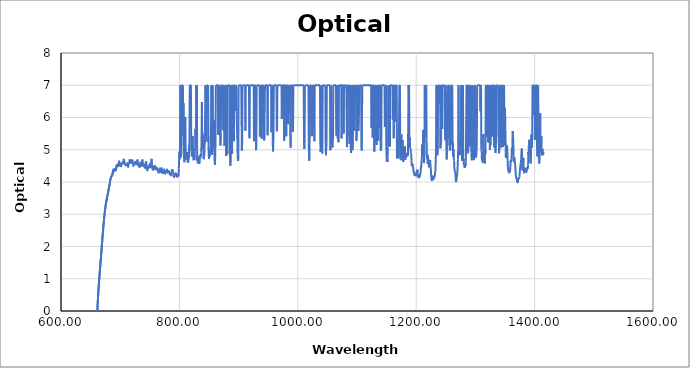
| Category | Optical Density |
|---|---|
| 365.0 | -1.958 |
| 365.5 | -1.958 |
| 366.0 | -1.958 |
| 366.5 | -1.959 |
| 367.0 | -1.959 |
| 367.5 | -1.96 |
| 368.0 | -1.961 |
| 368.5 | -1.962 |
| 369.0 | -1.962 |
| 369.5 | -1.961 |
| 370.0 | -1.961 |
| 370.5 | -1.959 |
| 371.0 | -1.958 |
| 371.5 | -1.958 |
| 372.0 | -1.958 |
| 372.5 | -1.958 |
| 373.0 | -1.958 |
| 373.5 | -1.958 |
| 374.0 | -1.957 |
| 374.5 | -1.956 |
| 375.0 | -1.955 |
| 375.5 | -1.953 |
| 376.0 | -1.953 |
| 376.5 | -1.953 |
| 377.0 | -1.954 |
| 377.5 | -1.955 |
| 378.0 | -1.957 |
| 378.5 | -1.959 |
| 379.0 | -1.96 |
| 379.5 | -1.96 |
| 380.0 | -1.959 |
| 380.5 | -1.957 |
| 381.0 | -1.955 |
| 381.5 | -1.953 |
| 382.0 | -1.951 |
| 382.5 | -1.95 |
| 383.0 | -1.951 |
| 383.5 | -1.953 |
| 384.0 | -1.956 |
| 384.5 | -1.959 |
| 385.0 | -1.961 |
| 385.5 | -1.962 |
| 386.0 | -1.962 |
| 386.5 | -1.963 |
| 387.0 | -1.964 |
| 387.5 | -1.964 |
| 388.0 | -1.962 |
| 388.5 | -1.96 |
| 389.0 | -1.958 |
| 389.5 | -1.958 |
| 390.0 | -1.959 |
| 390.5 | -1.961 |
| 391.0 | -1.964 |
| 391.5 | -1.966 |
| 392.0 | -1.967 |
| 392.5 | -1.967 |
| 393.0 | -1.967 |
| 393.5 | -1.965 |
| 394.0 | -1.964 |
| 394.5 | -1.963 |
| 395.0 | -1.964 |
| 395.5 | -1.965 |
| 396.0 | -1.967 |
| 396.5 | -1.967 |
| 397.0 | -1.966 |
| 397.5 | -1.965 |
| 398.0 | -1.963 |
| 398.5 | -1.963 |
| 399.0 | -1.963 |
| 399.5 | -1.964 |
| 400.0 | -1.965 |
| 400.5 | -1.966 |
| 401.0 | -1.968 |
| 401.5 | -1.97 |
| 402.0 | -1.971 |
| 402.5 | -1.971 |
| 403.0 | -1.971 |
| 403.5 | -1.971 |
| 404.0 | -1.97 |
| 404.5 | -1.97 |
| 405.0 | -1.97 |
| 405.5 | -1.969 |
| 406.0 | -1.969 |
| 406.5 | -1.969 |
| 407.0 | -1.969 |
| 407.5 | -1.969 |
| 408.0 | -1.969 |
| 408.5 | -1.969 |
| 409.0 | -1.969 |
| 409.5 | -1.97 |
| 410.0 | -1.97 |
| 410.5 | -1.97 |
| 411.0 | -1.97 |
| 411.5 | -1.971 |
| 412.0 | -1.972 |
| 412.5 | -1.973 |
| 413.0 | -1.974 |
| 413.5 | -1.973 |
| 414.0 | -1.973 |
| 414.5 | -1.972 |
| 415.0 | -1.972 |
| 415.5 | -1.972 |
| 416.0 | -1.972 |
| 416.5 | -1.971 |
| 417.0 | -1.97 |
| 417.5 | -1.969 |
| 418.0 | -1.968 |
| 418.5 | -1.969 |
| 419.0 | -1.971 |
| 419.5 | -1.972 |
| 420.0 | -1.974 |
| 420.5 | -1.974 |
| 421.0 | -1.974 |
| 421.5 | -1.974 |
| 422.0 | -1.973 |
| 422.5 | -1.971 |
| 423.0 | -1.97 |
| 423.5 | -1.968 |
| 424.0 | -1.968 |
| 424.5 | -1.968 |
| 425.0 | -1.97 |
| 425.5 | -1.972 |
| 426.0 | -1.974 |
| 426.5 | -1.975 |
| 427.0 | -1.975 |
| 427.5 | -1.976 |
| 428.0 | -1.976 |
| 428.5 | -1.976 |
| 429.0 | -1.976 |
| 429.5 | -1.975 |
| 430.0 | -1.975 |
| 430.5 | -1.975 |
| 431.0 | -1.974 |
| 431.5 | -1.974 |
| 432.0 | -1.973 |
| 432.5 | -1.972 |
| 433.0 | -1.972 |
| 433.5 | -1.971 |
| 434.0 | -1.97 |
| 434.5 | -1.97 |
| 435.0 | -1.97 |
| 435.5 | -1.971 |
| 436.0 | -1.971 |
| 436.5 | -1.972 |
| 437.0 | -1.973 |
| 437.5 | -1.974 |
| 438.0 | -1.975 |
| 438.5 | -1.976 |
| 439.0 | -1.976 |
| 439.5 | -1.976 |
| 440.0 | -1.976 |
| 440.5 | -1.976 |
| 441.0 | -1.977 |
| 441.5 | -1.977 |
| 442.0 | -1.977 |
| 442.5 | -1.976 |
| 443.0 | -1.976 |
| 443.5 | -1.976 |
| 444.0 | -1.976 |
| 444.5 | -1.976 |
| 445.0 | -1.974 |
| 445.5 | -1.973 |
| 446.0 | -1.972 |
| 446.5 | -1.971 |
| 447.0 | -1.971 |
| 447.5 | -1.972 |
| 448.0 | -1.973 |
| 448.5 | -1.975 |
| 449.0 | -1.976 |
| 449.5 | -1.976 |
| 450.0 | -1.976 |
| 450.5 | -1.976 |
| 451.0 | -1.975 |
| 451.5 | -1.975 |
| 452.0 | -1.974 |
| 452.5 | -1.972 |
| 453.0 | -1.97 |
| 453.5 | -1.968 |
| 454.0 | -1.966 |
| 454.5 | -1.966 |
| 455.0 | -1.966 |
| 455.5 | -1.967 |
| 456.0 | -1.969 |
| 456.5 | -1.971 |
| 457.0 | -1.973 |
| 457.5 | -1.975 |
| 458.0 | -1.976 |
| 458.5 | -1.976 |
| 459.0 | -1.976 |
| 459.5 | -1.975 |
| 460.0 | -1.974 |
| 460.5 | -1.973 |
| 461.0 | -1.971 |
| 461.5 | -1.97 |
| 462.0 | -1.97 |
| 462.5 | -1.969 |
| 463.0 | -1.969 |
| 463.5 | -1.969 |
| 464.0 | -1.968 |
| 464.5 | -1.968 |
| 465.0 | -1.967 |
| 465.5 | -1.967 |
| 466.0 | -1.967 |
| 466.5 | -1.968 |
| 467.0 | -1.969 |
| 467.5 | -1.971 |
| 468.0 | -1.972 |
| 468.5 | -1.973 |
| 469.0 | -1.974 |
| 469.5 | -1.975 |
| 470.0 | -1.976 |
| 470.5 | -1.977 |
| 471.0 | -1.978 |
| 471.5 | -1.978 |
| 472.0 | -1.978 |
| 472.5 | -1.978 |
| 473.0 | -1.978 |
| 473.5 | -1.978 |
| 474.0 | -1.978 |
| 474.5 | -1.978 |
| 475.0 | -1.978 |
| 475.5 | -1.978 |
| 476.0 | -1.979 |
| 476.5 | -1.979 |
| 477.0 | -1.979 |
| 477.5 | -1.978 |
| 478.0 | -1.977 |
| 478.5 | -1.976 |
| 479.0 | -1.973 |
| 479.5 | -1.971 |
| 480.0 | -1.968 |
| 480.5 | -1.966 |
| 481.0 | -1.964 |
| 481.5 | -1.962 |
| 482.0 | -1.961 |
| 482.5 | -1.961 |
| 483.0 | -1.962 |
| 483.5 | -1.962 |
| 484.0 | -1.964 |
| 484.5 | -1.966 |
| 485.0 | -1.968 |
| 485.5 | -1.97 |
| 486.0 | -1.973 |
| 486.5 | -1.975 |
| 487.0 | -1.977 |
| 487.5 | -1.978 |
| 488.0 | -1.978 |
| 488.5 | -1.977 |
| 489.0 | -1.976 |
| 489.5 | -1.974 |
| 490.0 | -1.973 |
| 490.5 | -1.973 |
| 491.0 | -1.973 |
| 491.5 | -1.975 |
| 492.0 | -1.977 |
| 492.5 | -1.979 |
| 493.0 | -1.98 |
| 493.5 | -1.981 |
| 494.0 | -1.982 |
| 494.5 | -1.981 |
| 495.0 | -1.979 |
| 495.5 | -1.976 |
| 496.0 | -1.973 |
| 496.5 | -1.97 |
| 497.0 | -1.968 |
| 497.5 | -1.966 |
| 498.0 | -1.966 |
| 498.5 | -1.968 |
| 499.0 | -1.97 |
| 499.5 | -1.973 |
| 500.0 | -1.975 |
| 500.5 | -1.978 |
| 501.0 | -1.979 |
| 501.5 | -1.98 |
| 502.0 | -1.981 |
| 502.5 | -1.981 |
| 503.0 | -1.982 |
| 503.5 | -1.982 |
| 504.0 | -1.982 |
| 504.5 | -1.982 |
| 505.0 | -1.981 |
| 505.5 | -1.98 |
| 506.0 | -1.979 |
| 506.5 | -1.979 |
| 507.0 | -1.978 |
| 507.5 | -1.979 |
| 508.0 | -1.98 |
| 508.5 | -1.981 |
| 509.0 | -1.981 |
| 509.5 | -1.981 |
| 510.0 | -1.981 |
| 510.5 | -1.98 |
| 511.0 | -1.978 |
| 511.5 | -1.976 |
| 512.0 | -1.973 |
| 512.5 | -1.97 |
| 513.0 | -1.966 |
| 513.5 | -1.963 |
| 514.0 | -1.959 |
| 514.5 | -1.955 |
| 515.0 | -1.951 |
| 515.5 | -1.949 |
| 516.0 | -1.948 |
| 516.5 | -1.949 |
| 517.0 | -1.952 |
| 517.5 | -1.956 |
| 518.0 | -1.961 |
| 518.5 | -1.966 |
| 519.0 | -1.971 |
| 519.5 | -1.975 |
| 520.0 | -1.978 |
| 520.5 | -1.98 |
| 521.0 | -1.981 |
| 521.5 | -1.982 |
| 522.0 | -1.982 |
| 522.5 | -1.981 |
| 523.0 | -1.98 |
| 523.5 | -1.978 |
| 524.0 | -1.976 |
| 524.5 | -1.974 |
| 525.0 | -1.973 |
| 525.5 | -1.972 |
| 526.0 | -1.973 |
| 526.5 | -1.974 |
| 527.0 | -1.976 |
| 527.5 | -1.978 |
| 528.0 | -1.98 |
| 528.5 | -1.982 |
| 529.0 | -1.983 |
| 529.5 | -1.984 |
| 530.0 | -1.984 |
| 530.5 | -1.984 |
| 531.0 | -1.985 |
| 531.5 | -1.985 |
| 532.0 | -1.985 |
| 532.5 | -1.985 |
| 533.0 | -1.985 |
| 533.5 | -1.985 |
| 534.0 | -1.984 |
| 534.5 | -1.984 |
| 535.0 | -1.983 |
| 535.5 | -1.983 |
| 536.0 | -1.983 |
| 536.5 | -1.984 |
| 537.0 | -1.985 |
| 537.5 | -1.985 |
| 538.0 | -1.986 |
| 538.5 | -1.985 |
| 539.0 | -1.985 |
| 539.5 | -1.984 |
| 540.0 | -1.982 |
| 540.5 | -1.981 |
| 541.0 | -1.981 |
| 541.5 | -1.981 |
| 542.0 | -1.981 |
| 542.5 | -1.982 |
| 543.0 | -1.983 |
| 543.5 | -1.984 |
| 544.0 | -1.985 |
| 544.5 | -1.985 |
| 545.0 | -1.986 |
| 545.5 | -1.986 |
| 546.0 | -1.987 |
| 546.5 | -1.987 |
| 547.0 | -1.986 |
| 547.5 | -1.985 |
| 548.0 | -1.984 |
| 548.5 | -1.983 |
| 549.0 | -1.981 |
| 549.5 | -1.98 |
| 550.0 | -1.978 |
| 550.5 | -1.976 |
| 551.0 | -1.975 |
| 551.5 | -1.974 |
| 552.0 | -1.974 |
| 552.5 | -1.974 |
| 553.0 | -1.976 |
| 553.5 | -1.978 |
| 554.0 | -1.981 |
| 554.5 | -1.983 |
| 555.0 | -1.985 |
| 555.5 | -1.986 |
| 556.0 | -1.987 |
| 556.5 | -1.987 |
| 557.0 | -1.987 |
| 557.5 | -1.987 |
| 558.0 | -1.986 |
| 558.5 | -1.986 |
| 559.0 | -1.986 |
| 559.5 | -1.985 |
| 560.0 | -1.984 |
| 560.5 | -1.983 |
| 561.0 | -1.982 |
| 561.5 | -1.98 |
| 562.0 | -1.978 |
| 562.5 | -1.977 |
| 563.0 | -1.977 |
| 563.5 | -1.977 |
| 564.0 | -1.978 |
| 564.5 | -1.98 |
| 565.0 | -1.981 |
| 565.5 | -1.982 |
| 566.0 | -1.983 |
| 566.5 | -1.984 |
| 567.0 | -1.984 |
| 567.5 | -1.984 |
| 568.0 | -1.984 |
| 568.5 | -1.984 |
| 569.0 | -1.984 |
| 569.5 | -1.984 |
| 570.0 | -1.984 |
| 570.5 | -1.983 |
| 571.0 | -1.982 |
| 571.5 | -1.981 |
| 572.0 | -1.98 |
| 572.5 | -1.978 |
| 573.0 | -1.976 |
| 573.5 | -1.974 |
| 574.0 | -1.973 |
| 574.5 | -1.973 |
| 575.0 | -1.974 |
| 575.5 | -1.975 |
| 576.0 | -1.977 |
| 576.5 | -1.979 |
| 577.0 | -1.98 |
| 577.5 | -1.981 |
| 578.0 | -1.981 |
| 578.5 | -1.981 |
| 579.0 | -1.98 |
| 579.5 | -1.98 |
| 580.0 | -1.979 |
| 580.5 | -1.979 |
| 581.0 | -1.98 |
| 581.5 | -1.98 |
| 582.0 | -1.981 |
| 582.5 | -1.981 |
| 583.0 | -1.98 |
| 583.5 | -1.979 |
| 584.0 | -1.977 |
| 584.5 | -1.976 |
| 585.0 | -1.974 |
| 585.5 | -1.973 |
| 586.0 | -1.972 |
| 586.5 | -1.973 |
| 587.0 | -1.974 |
| 587.5 | -1.976 |
| 588.0 | -1.977 |
| 588.5 | -1.978 |
| 589.0 | -1.979 |
| 589.5 | -1.979 |
| 590.0 | -1.978 |
| 590.5 | -1.978 |
| 591.0 | -1.978 |
| 591.5 | -1.978 |
| 592.0 | -1.978 |
| 592.5 | -1.979 |
| 593.0 | -1.98 |
| 593.5 | -1.981 |
| 594.0 | -1.982 |
| 594.5 | -1.983 |
| 595.0 | -1.983 |
| 595.5 | -1.983 |
| 596.0 | -1.983 |
| 596.5 | -1.983 |
| 597.0 | -1.982 |
| 597.5 | -1.982 |
| 598.0 | -1.982 |
| 598.5 | -1.983 |
| 599.0 | -1.983 |
| 599.5 | -1.984 |
| 600.0 | -1.985 |
| 600.5 | -1.985 |
| 601.0 | -1.985 |
| 601.5 | -1.985 |
| 602.0 | -1.984 |
| 602.5 | -1.982 |
| 603.0 | -1.98 |
| 603.5 | -1.979 |
| 604.0 | -1.978 |
| 604.5 | -1.978 |
| 605.0 | -1.978 |
| 605.5 | -1.979 |
| 606.0 | -1.98 |
| 606.5 | -1.981 |
| 607.0 | -1.982 |
| 607.5 | -1.983 |
| 608.0 | -1.984 |
| 608.5 | -1.984 |
| 609.0 | -1.985 |
| 609.5 | -1.985 |
| 610.0 | -1.985 |
| 610.5 | -1.986 |
| 611.0 | -1.986 |
| 611.5 | -1.986 |
| 612.0 | -1.986 |
| 612.5 | -1.986 |
| 613.0 | -1.985 |
| 613.5 | -1.984 |
| 614.0 | -1.983 |
| 614.5 | -1.982 |
| 615.0 | -1.98 |
| 615.5 | -1.978 |
| 616.0 | -1.977 |
| 616.5 | -1.976 |
| 617.0 | -1.975 |
| 617.5 | -1.976 |
| 618.0 | -1.977 |
| 618.5 | -1.978 |
| 619.0 | -1.98 |
| 619.5 | -1.981 |
| 620.0 | -1.983 |
| 620.5 | -1.984 |
| 621.0 | -1.985 |
| 621.5 | -1.986 |
| 622.0 | -1.986 |
| 622.5 | -1.986 |
| 623.0 | -1.985 |
| 623.5 | -1.985 |
| 624.0 | -1.985 |
| 624.5 | -1.985 |
| 625.0 | -1.985 |
| 625.5 | -1.984 |
| 626.0 | -1.983 |
| 626.5 | -1.981 |
| 627.0 | -1.979 |
| 627.5 | -1.977 |
| 628.0 | -1.975 |
| 628.5 | -1.973 |
| 629.0 | -1.972 |
| 629.5 | -1.972 |
| 630.0 | -1.973 |
| 630.5 | -1.974 |
| 631.0 | -1.976 |
| 631.5 | -1.977 |
| 632.0 | -1.979 |
| 632.5 | -1.98 |
| 633.0 | -1.981 |
| 633.5 | -1.981 |
| 634.0 | -1.982 |
| 634.5 | -1.982 |
| 635.0 | -1.983 |
| 635.5 | -1.983 |
| 636.0 | -1.984 |
| 636.5 | -1.985 |
| 637.0 | -1.986 |
| 637.5 | -1.986 |
| 638.0 | -1.986 |
| 638.5 | -1.986 |
| 639.0 | -1.986 |
| 639.5 | -1.985 |
| 640.0 | -1.984 |
| 640.5 | -1.983 |
| 641.0 | -1.982 |
| 641.5 | -1.982 |
| 642.0 | -1.983 |
| 642.5 | -1.983 |
| 643.0 | -1.984 |
| 643.5 | -1.985 |
| 644.0 | -1.985 |
| 644.5 | -1.985 |
| 645.0 | -1.984 |
| 645.5 | -1.983 |
| 646.0 | -1.982 |
| 646.5 | -1.982 |
| 647.0 | -1.982 |
| 647.5 | -1.982 |
| 648.0 | -1.983 |
| 648.5 | -1.984 |
| 649.0 | -1.986 |
| 649.5 | -1.987 |
| 650.0 | -1.988 |
| 650.5 | -1.988 |
| 651.0 | -1.987 |
| 651.5 | -1.987 |
| 652.0 | -1.987 |
| 652.5 | -1.987 |
| 653.0 | -1.986 |
| 653.5 | -1.985 |
| 654.0 | -1.979 |
| 654.5 | -1.969 |
| 655.0 | -1.949 |
| 655.5 | -1.916 |
| 656.0 | -1.865 |
| 656.5 | -1.791 |
| 657.0 | -1.691 |
| 657.5 | -1.563 |
| 658.0 | -1.403 |
| 658.5 | -1.217 |
| 659.0 | -1.008 |
| 659.5 | -0.786 |
| 660.0 | -0.56 |
| 660.5 | -0.34 |
| 661.0 | -0.132 |
| 661.5 | 0.064 |
| 662.0 | 0.244 |
| 662.5 | 0.412 |
| 663.0 | 0.568 |
| 663.5 | 0.712 |
| 664.0 | 0.847 |
| 664.5 | 0.974 |
| 665.0 | 1.095 |
| 665.5 | 1.213 |
| 666.0 | 1.328 |
| 666.5 | 1.442 |
| 667.0 | 1.557 |
| 667.5 | 1.672 |
| 668.0 | 1.79 |
| 668.5 | 1.908 |
| 669.0 | 2.026 |
| 669.5 | 2.146 |
| 670.0 | 2.263 |
| 670.5 | 2.378 |
| 671.0 | 2.491 |
| 671.5 | 2.6 |
| 672.0 | 2.705 |
| 672.5 | 2.804 |
| 673.0 | 2.897 |
| 673.5 | 2.984 |
| 674.0 | 3.063 |
| 674.5 | 3.141 |
| 675.0 | 3.215 |
| 675.5 | 3.28 |
| 676.0 | 3.339 |
| 676.5 | 3.392 |
| 677.0 | 3.443 |
| 677.5 | 3.493 |
| 678.0 | 3.537 |
| 678.5 | 3.582 |
| 679.0 | 3.621 |
| 679.5 | 3.667 |
| 680.0 | 3.723 |
| 680.5 | 3.779 |
| 681.0 | 3.834 |
| 681.5 | 3.871 |
| 682.0 | 3.915 |
| 682.5 | 3.967 |
| 683.0 | 4.035 |
| 683.5 | 4.08 |
| 684.0 | 4.109 |
| 684.5 | 4.145 |
| 685.0 | 4.165 |
| 685.5 | 4.189 |
| 686.0 | 4.195 |
| 686.5 | 4.216 |
| 687.0 | 4.241 |
| 687.5 | 4.298 |
| 688.0 | 4.354 |
| 688.5 | 4.381 |
| 689.0 | 4.326 |
| 689.5 | 4.345 |
| 690.0 | 4.357 |
| 690.5 | 4.397 |
| 691.0 | 4.403 |
| 691.5 | 4.402 |
| 692.0 | 4.395 |
| 692.5 | 4.361 |
| 693.0 | 4.404 |
| 693.5 | 4.447 |
| 694.0 | 4.509 |
| 694.5 | 4.506 |
| 695.0 | 4.513 |
| 695.5 | 4.53 |
| 696.0 | 4.546 |
| 696.5 | 4.498 |
| 697.0 | 4.499 |
| 697.5 | 4.529 |
| 698.0 | 4.633 |
| 698.5 | 4.635 |
| 699.0 | 4.595 |
| 699.5 | 4.568 |
| 700.0 | 4.539 |
| 700.5 | 4.493 |
| 701.0 | 4.502 |
| 701.5 | 4.492 |
| 702.0 | 4.551 |
| 702.5 | 4.55 |
| 703.0 | 4.585 |
| 703.5 | 4.567 |
| 704.0 | 4.581 |
| 704.5 | 4.581 |
| 705.0 | 4.607 |
| 705.5 | 4.674 |
| 706.0 | 4.696 |
| 706.5 | 4.688 |
| 707.0 | 4.629 |
| 707.5 | 4.607 |
| 708.0 | 4.544 |
| 708.5 | 4.527 |
| 709.0 | 4.515 |
| 709.5 | 4.533 |
| 710.0 | 4.532 |
| 710.5 | 4.541 |
| 711.0 | 4.532 |
| 711.5 | 4.543 |
| 712.0 | 4.586 |
| 712.5 | 4.549 |
| 713.0 | 4.493 |
| 713.5 | 4.469 |
| 714.0 | 4.539 |
| 714.5 | 4.58 |
| 715.0 | 4.585 |
| 715.5 | 4.604 |
| 716.0 | 4.705 |
| 716.5 | 4.677 |
| 717.0 | 4.64 |
| 717.5 | 4.592 |
| 718.0 | 4.641 |
| 718.5 | 4.649 |
| 719.0 | 4.601 |
| 719.5 | 4.63 |
| 720.0 | 4.65 |
| 720.5 | 4.697 |
| 721.0 | 4.625 |
| 721.5 | 4.563 |
| 722.0 | 4.505 |
| 722.5 | 4.503 |
| 723.0 | 4.533 |
| 723.5 | 4.554 |
| 724.0 | 4.575 |
| 724.5 | 4.568 |
| 725.0 | 4.596 |
| 725.5 | 4.631 |
| 726.0 | 4.596 |
| 726.5 | 4.579 |
| 727.0 | 4.548 |
| 727.5 | 4.56 |
| 728.0 | 4.58 |
| 728.5 | 4.619 |
| 729.0 | 4.698 |
| 729.5 | 4.649 |
| 730.0 | 4.557 |
| 730.5 | 4.511 |
| 731.0 | 4.53 |
| 731.5 | 4.518 |
| 732.0 | 4.498 |
| 732.5 | 4.454 |
| 733.0 | 4.499 |
| 733.5 | 4.55 |
| 734.0 | 4.602 |
| 734.5 | 4.594 |
| 735.0 | 4.523 |
| 735.5 | 4.504 |
| 736.0 | 4.475 |
| 736.5 | 4.584 |
| 737.0 | 4.637 |
| 737.5 | 4.698 |
| 738.0 | 4.62 |
| 738.5 | 4.535 |
| 739.0 | 4.522 |
| 739.5 | 4.537 |
| 740.0 | 4.542 |
| 740.5 | 4.543 |
| 741.0 | 4.444 |
| 741.5 | 4.489 |
| 742.0 | 4.419 |
| 742.5 | 4.502 |
| 743.0 | 4.548 |
| 743.5 | 4.645 |
| 744.0 | 4.587 |
| 744.5 | 4.517 |
| 745.0 | 4.405 |
| 745.5 | 4.385 |
| 746.0 | 4.361 |
| 746.5 | 4.439 |
| 747.0 | 4.483 |
| 747.5 | 4.476 |
| 748.0 | 4.462 |
| 748.5 | 4.441 |
| 749.0 | 4.465 |
| 749.5 | 4.513 |
| 750.0 | 4.564 |
| 750.5 | 4.515 |
| 751.0 | 4.484 |
| 751.5 | 4.435 |
| 752.0 | 4.524 |
| 752.5 | 4.613 |
| 753.0 | 4.719 |
| 753.5 | 4.581 |
| 754.0 | 4.453 |
| 754.5 | 4.398 |
| 755.0 | 4.433 |
| 755.5 | 4.401 |
| 756.0 | 4.376 |
| 756.5 | 4.395 |
| 757.0 | 4.426 |
| 757.5 | 4.507 |
| 758.0 | 4.458 |
| 758.5 | 4.504 |
| 759.0 | 4.455 |
| 759.5 | 4.479 |
| 760.0 | 4.411 |
| 760.5 | 4.394 |
| 761.0 | 4.388 |
| 761.5 | 4.403 |
| 762.0 | 4.437 |
| 762.5 | 4.405 |
| 763.0 | 4.374 |
| 763.5 | 4.36 |
| 764.0 | 4.329 |
| 764.5 | 4.329 |
| 765.0 | 4.27 |
| 765.5 | 4.338 |
| 766.0 | 4.369 |
| 766.5 | 4.421 |
| 767.0 | 4.386 |
| 767.5 | 4.34 |
| 768.0 | 4.333 |
| 768.5 | 4.308 |
| 769.0 | 4.36 |
| 769.5 | 4.421 |
| 770.0 | 4.425 |
| 770.5 | 4.365 |
| 771.0 | 4.266 |
| 771.5 | 4.28 |
| 772.0 | 4.272 |
| 772.5 | 4.321 |
| 773.0 | 4.303 |
| 773.5 | 4.325 |
| 774.0 | 4.373 |
| 774.5 | 4.395 |
| 775.0 | 4.381 |
| 775.5 | 4.242 |
| 776.0 | 4.27 |
| 776.5 | 4.277 |
| 777.0 | 4.369 |
| 777.5 | 4.301 |
| 778.0 | 4.336 |
| 778.5 | 4.346 |
| 779.0 | 4.384 |
| 779.5 | 4.356 |
| 780.0 | 4.326 |
| 780.5 | 4.283 |
| 781.0 | 4.321 |
| 781.5 | 4.318 |
| 782.0 | 4.363 |
| 782.5 | 4.28 |
| 783.0 | 4.278 |
| 783.5 | 4.254 |
| 784.0 | 4.235 |
| 784.5 | 4.282 |
| 785.0 | 4.23 |
| 785.5 | 4.22 |
| 786.0 | 4.2 |
| 786.5 | 4.217 |
| 787.0 | 4.349 |
| 787.5 | 4.311 |
| 788.0 | 4.401 |
| 788.5 | 4.326 |
| 789.0 | 4.33 |
| 789.5 | 4.294 |
| 790.0 | 4.215 |
| 790.5 | 4.164 |
| 791.0 | 4.161 |
| 791.5 | 4.218 |
| 792.0 | 4.235 |
| 792.5 | 4.228 |
| 793.0 | 4.234 |
| 793.5 | 4.26 |
| 794.0 | 4.273 |
| 794.5 | 4.233 |
| 795.0 | 4.201 |
| 795.5 | 4.142 |
| 796.0 | 4.204 |
| 796.5 | 4.216 |
| 797.0 | 4.217 |
| 797.5 | 4.174 |
| 798.0 | 4.208 |
| 798.5 | 4.184 |
| 799.0 | 4.414 |
| 799.5 | 4.675 |
| 800.0 | 4.944 |
| 800.5 | 4.706 |
| 801.0 | 4.954 |
| 801.5 | 7 |
| 802.0 | 7 |
| 802.5 | 4.769 |
| 803.0 | 4.829 |
| 803.5 | 5.277 |
| 804.0 | 7 |
| 804.5 | 7 |
| 805.0 | 7 |
| 805.5 | 7 |
| 806.0 | 7 |
| 806.5 | 5.436 |
| 807.0 | 6.438 |
| 807.5 | 4.88 |
| 808.0 | 4.721 |
| 808.5 | 4.61 |
| 809.0 | 4.739 |
| 809.5 | 5.811 |
| 810.0 | 6.018 |
| 810.5 | 5.084 |
| 811.0 | 4.911 |
| 811.5 | 4.701 |
| 812.0 | 4.887 |
| 812.5 | 4.781 |
| 813.0 | 4.926 |
| 813.5 | 4.775 |
| 814.0 | 4.62 |
| 814.5 | 4.622 |
| 815.0 | 4.6 |
| 815.5 | 4.789 |
| 816.0 | 4.754 |
| 816.5 | 5.182 |
| 817.0 | 5.26 |
| 817.5 | 7 |
| 818.0 | 7 |
| 818.5 | 7 |
| 819.0 | 7 |
| 819.5 | 7 |
| 820.0 | 4.958 |
| 820.5 | 4.946 |
| 821.0 | 4.794 |
| 821.5 | 4.828 |
| 822.0 | 4.964 |
| 822.5 | 5.422 |
| 823.0 | 4.933 |
| 823.5 | 4.804 |
| 824.0 | 4.672 |
| 824.5 | 4.808 |
| 825.0 | 4.801 |
| 825.5 | 4.694 |
| 826.0 | 4.89 |
| 826.5 | 4.935 |
| 827.0 | 5.654 |
| 827.5 | 5.396 |
| 828.0 | 5.651 |
| 828.5 | 7 |
| 829.0 | 6.438 |
| 829.5 | 7 |
| 830.0 | 4.653 |
| 830.5 | 4.807 |
| 831.0 | 4.578 |
| 831.5 | 4.652 |
| 832.0 | 4.601 |
| 832.5 | 4.786 |
| 833.0 | 4.564 |
| 833.5 | 4.64 |
| 834.0 | 4.581 |
| 834.5 | 4.804 |
| 835.0 | 4.725 |
| 835.5 | 4.845 |
| 836.0 | 4.871 |
| 836.5 | 4.778 |
| 837.0 | 4.917 |
| 837.5 | 5.44 |
| 838.0 | 6.482 |
| 838.5 | 5.139 |
| 839.0 | 5.029 |
| 839.5 | 5.474 |
| 840.0 | 5.376 |
| 840.5 | 4.98 |
| 841.0 | 4.707 |
| 841.5 | 4.764 |
| 842.0 | 4.841 |
| 842.5 | 5.034 |
| 843.0 | 5.566 |
| 843.5 | 5.995 |
| 844.0 | 7 |
| 844.5 | 6.327 |
| 845.0 | 5.487 |
| 845.5 | 5.371 |
| 846.0 | 5.246 |
| 846.5 | 7 |
| 847.0 | 7 |
| 847.5 | 7 |
| 848.0 | 7 |
| 848.5 | 7 |
| 849.0 | 5.457 |
| 849.5 | 4.842 |
| 850.0 | 4.717 |
| 850.5 | 4.958 |
| 851.0 | 4.774 |
| 851.5 | 4.89 |
| 852.0 | 5.018 |
| 852.5 | 4.966 |
| 853.0 | 5.172 |
| 853.5 | 5.792 |
| 854.0 | 7 |
| 854.5 | 5.255 |
| 855.0 | 4.964 |
| 855.5 | 4.847 |
| 856.0 | 7 |
| 856.5 | 5.831 |
| 857.0 | 5.342 |
| 857.5 | 5.054 |
| 858.0 | 5.293 |
| 858.5 | 5.911 |
| 859.0 | 4.985 |
| 859.5 | 4.663 |
| 860.0 | 4.537 |
| 860.5 | 4.793 |
| 861.0 | 5.301 |
| 861.5 | 7 |
| 862.0 | 7 |
| 862.5 | 7 |
| 863.0 | 7 |
| 863.5 | 7 |
| 864.0 | 7 |
| 864.5 | 7 |
| 865.0 | 7 |
| 865.5 | 5.466 |
| 866.0 | 5.549 |
| 866.5 | 7 |
| 867.0 | 7 |
| 867.5 | 7 |
| 868.0 | 7 |
| 868.5 | 5.857 |
| 869.0 | 5.143 |
| 869.5 | 5.13 |
| 870.0 | 5.62 |
| 870.5 | 7 |
| 871.0 | 7 |
| 871.5 | 7 |
| 872.0 | 7 |
| 872.5 | 7 |
| 873.0 | 7 |
| 873.5 | 7 |
| 874.0 | 5.595 |
| 874.5 | 5.602 |
| 875.0 | 7 |
| 875.5 | 6.335 |
| 876.0 | 5.115 |
| 876.5 | 5.215 |
| 877.0 | 5.811 |
| 877.5 | 7 |
| 878.0 | 7 |
| 878.5 | 6.15 |
| 879.0 | 4.806 |
| 879.5 | 5.204 |
| 880.0 | 5.446 |
| 880.5 | 7 |
| 881.0 | 4.858 |
| 881.5 | 7 |
| 882.0 | 7 |
| 882.5 | 7 |
| 883.0 | 7 |
| 883.5 | 7 |
| 884.0 | 7 |
| 884.5 | 7 |
| 885.0 | 7 |
| 885.5 | 4.901 |
| 886.0 | 4.504 |
| 886.5 | 4.596 |
| 887.0 | 5.133 |
| 887.5 | 7 |
| 888.0 | 7 |
| 888.5 | 5.23 |
| 889.0 | 4.872 |
| 889.5 | 7 |
| 890.0 | 7 |
| 890.5 | 7 |
| 891.0 | 5.617 |
| 891.5 | 7 |
| 892.0 | 5.26 |
| 892.5 | 7 |
| 893.0 | 7 |
| 893.5 | 7 |
| 894.0 | 7 |
| 894.5 | 6.212 |
| 895.0 | 7 |
| 895.5 | 7 |
| 896.0 | 7 |
| 896.5 | 6.738 |
| 897.0 | 5.77 |
| 897.5 | 5.557 |
| 898.0 | 5.25 |
| 898.5 | 4.798 |
| 899.0 | 4.65 |
| 899.5 | 4.689 |
| 900.0 | 7 |
| 900.5 | 7 |
| 901.0 | 7 |
| 901.5 | 7 |
| 902.0 | 7 |
| 902.5 | 7 |
| 903.0 | 7 |
| 903.5 | 7 |
| 904.0 | 7 |
| 904.5 | 7 |
| 905.0 | 5.957 |
| 905.5 | 4.974 |
| 906.0 | 5.162 |
| 906.5 | 7 |
| 907.0 | 7 |
| 907.5 | 7 |
| 908.0 | 7 |
| 908.5 | 7 |
| 909.0 | 7 |
| 909.5 | 7 |
| 910.0 | 7 |
| 910.5 | 7 |
| 911.0 | 7 |
| 911.5 | 5.59 |
| 912.0 | 7 |
| 912.5 | 7 |
| 913.0 | 7 |
| 913.5 | 7 |
| 914.0 | 7 |
| 914.5 | 7 |
| 915.0 | 7 |
| 915.5 | 7 |
| 916.0 | 7 |
| 916.5 | 7 |
| 917.0 | 7 |
| 917.5 | 7 |
| 918.0 | 5.568 |
| 918.5 | 5.353 |
| 919.0 | 7 |
| 919.5 | 7 |
| 920.0 | 7 |
| 920.5 | 7 |
| 921.0 | 7 |
| 921.5 | 7 |
| 922.0 | 7 |
| 922.5 | 7 |
| 923.0 | 7 |
| 923.5 | 7 |
| 924.0 | 7 |
| 924.5 | 7 |
| 925.0 | 7 |
| 925.5 | 7 |
| 926.0 | 5.266 |
| 926.5 | 7 |
| 927.0 | 7 |
| 927.5 | 7 |
| 928.0 | 7 |
| 928.5 | 7 |
| 929.0 | 5.864 |
| 929.5 | 4.985 |
| 930.0 | 5.149 |
| 930.5 | 7 |
| 931.0 | 7 |
| 931.5 | 7 |
| 932.0 | 7 |
| 932.5 | 7 |
| 933.0 | 7 |
| 933.5 | 7 |
| 934.0 | 7 |
| 934.5 | 7 |
| 935.0 | 7 |
| 935.5 | 7 |
| 936.0 | 5.403 |
| 936.5 | 7 |
| 937.0 | 5.497 |
| 937.5 | 7 |
| 938.0 | 7 |
| 938.5 | 7 |
| 939.0 | 5.341 |
| 939.5 | 6.01 |
| 940.0 | 7 |
| 940.5 | 7 |
| 941.0 | 7 |
| 941.5 | 7 |
| 942.0 | 7 |
| 942.5 | 6.374 |
| 943.0 | 5.294 |
| 943.5 | 5.286 |
| 944.0 | 6.211 |
| 944.5 | 7 |
| 945.0 | 7 |
| 945.5 | 7 |
| 946.0 | 7 |
| 946.5 | 7 |
| 947.0 | 7 |
| 947.5 | 7 |
| 948.0 | 7 |
| 948.5 | 7 |
| 949.0 | 5.449 |
| 949.5 | 7 |
| 950.0 | 7 |
| 950.5 | 7 |
| 951.0 | 7 |
| 951.5 | 7 |
| 952.0 | 7 |
| 952.5 | 7 |
| 953.0 | 7 |
| 953.5 | 7 |
| 954.0 | 7 |
| 954.5 | 7 |
| 955.0 | 7 |
| 955.5 | 5.544 |
| 956.0 | 7 |
| 956.5 | 7 |
| 957.0 | 7 |
| 957.5 | 5.868 |
| 958.0 | 4.946 |
| 958.5 | 5.054 |
| 959.0 | 5.616 |
| 959.5 | 7 |
| 960.0 | 7 |
| 960.5 | 7 |
| 961.0 | 7 |
| 961.5 | 7 |
| 962.0 | 7 |
| 962.5 | 7 |
| 963.0 | 7 |
| 963.5 | 7 |
| 964.0 | 7 |
| 964.5 | 5.572 |
| 965.0 | 5.62 |
| 965.5 | 7 |
| 966.0 | 7 |
| 966.5 | 7 |
| 967.0 | 7 |
| 967.5 | 7 |
| 968.0 | 7 |
| 968.5 | 7 |
| 969.0 | 7 |
| 969.5 | 7 |
| 970.0 | 7 |
| 970.5 | 7 |
| 971.0 | 7 |
| 971.5 | 7 |
| 972.0 | 7 |
| 972.5 | 7 |
| 973.0 | 5.951 |
| 973.5 | 7 |
| 974.0 | 7 |
| 974.5 | 7 |
| 975.0 | 7 |
| 975.5 | 7 |
| 976.0 | 7 |
| 976.5 | 7 |
| 977.0 | 5.279 |
| 977.5 | 7 |
| 978.0 | 7 |
| 978.5 | 7 |
| 979.0 | 7 |
| 979.5 | 7 |
| 980.0 | 7 |
| 980.5 | 5.421 |
| 981.0 | 7 |
| 981.5 | 7 |
| 982.0 | 7 |
| 982.5 | 7 |
| 983.0 | 7 |
| 983.5 | 5.796 |
| 984.0 | 5.79 |
| 984.5 | 7 |
| 985.0 | 7 |
| 985.5 | 7 |
| 986.0 | 7 |
| 986.5 | 7 |
| 987.0 | 6.217 |
| 987.5 | 5.401 |
| 988.0 | 5.059 |
| 988.5 | 7 |
| 989.0 | 7 |
| 989.5 | 7 |
| 990.0 | 7 |
| 990.5 | 7 |
| 991.0 | 7 |
| 991.5 | 5.549 |
| 992.0 | 5.745 |
| 992.5 | 7 |
| 993.0 | 7 |
| 993.5 | 7 |
| 994.0 | 7 |
| 994.5 | 7 |
| 995.0 | 7 |
| 995.5 | 7 |
| 996.0 | 7 |
| 996.5 | 7 |
| 997.0 | 7 |
| 997.5 | 7 |
| 998.0 | 7 |
| 998.5 | 7 |
| 999.0 | 7 |
| 999.5 | 7 |
| 1000.0 | 7 |
| 1000.5 | 7 |
| 1001.0 | 7 |
| 1001.5 | 7 |
| 1002.0 | 7 |
| 1002.5 | 7 |
| 1003.0 | 7 |
| 1003.5 | 7 |
| 1004.0 | 7 |
| 1004.5 | 7 |
| 1005.0 | 7 |
| 1005.5 | 7 |
| 1006.0 | 7 |
| 1006.5 | 7 |
| 1007.0 | 7 |
| 1007.5 | 7 |
| 1008.0 | 7 |
| 1008.5 | 7 |
| 1009.0 | 7 |
| 1009.5 | 7 |
| 1010.0 | 7 |
| 1010.5 | 5.266 |
| 1011.0 | 5.025 |
| 1011.5 | 5.199 |
| 1012.0 | 7 |
| 1012.5 | 7 |
| 1013.0 | 7 |
| 1013.5 | 7 |
| 1014.0 | 7 |
| 1014.5 | 7 |
| 1015.0 | 7 |
| 1015.5 | 7 |
| 1016.0 | 7 |
| 1016.5 | 7 |
| 1017.0 | 7 |
| 1017.5 | 7 |
| 1018.0 | 7 |
| 1018.5 | 5.224 |
| 1019.0 | 4.706 |
| 1019.5 | 4.659 |
| 1020.0 | 5.228 |
| 1020.5 | 7 |
| 1021.0 | 7 |
| 1021.5 | 7 |
| 1022.0 | 7 |
| 1022.5 | 7 |
| 1023.0 | 5.513 |
| 1023.5 | 5.421 |
| 1024.0 | 5.453 |
| 1024.5 | 7 |
| 1025.0 | 5.719 |
| 1025.5 | 7 |
| 1026.0 | 7 |
| 1026.5 | 7 |
| 1027.0 | 7 |
| 1027.5 | 7 |
| 1028.0 | 5.264 |
| 1028.5 | 7 |
| 1029.0 | 7 |
| 1029.5 | 7 |
| 1030.0 | 7 |
| 1030.5 | 7 |
| 1031.0 | 7 |
| 1031.5 | 7 |
| 1032.0 | 7 |
| 1032.5 | 7 |
| 1033.0 | 7 |
| 1033.5 | 7 |
| 1034.0 | 7 |
| 1034.5 | 7 |
| 1035.0 | 7 |
| 1035.5 | 7 |
| 1036.0 | 7 |
| 1036.5 | 7 |
| 1037.0 | 7 |
| 1037.5 | 7 |
| 1038.0 | 5.251 |
| 1038.5 | 4.934 |
| 1039.0 | 5.01 |
| 1039.5 | 5.906 |
| 1040.0 | 7 |
| 1040.5 | 5.138 |
| 1041.0 | 4.907 |
| 1041.5 | 4.884 |
| 1042.0 | 7 |
| 1042.5 | 7 |
| 1043.0 | 7 |
| 1043.5 | 7 |
| 1044.0 | 7 |
| 1044.5 | 7 |
| 1045.0 | 7 |
| 1045.5 | 7 |
| 1046.0 | 7 |
| 1046.5 | 7 |
| 1047.0 | 5.229 |
| 1047.5 | 4.83 |
| 1048.0 | 5.03 |
| 1048.5 | 5.197 |
| 1049.0 | 7 |
| 1049.5 | 7 |
| 1050.0 | 7 |
| 1050.5 | 7 |
| 1051.0 | 7 |
| 1051.5 | 7 |
| 1052.0 | 7 |
| 1052.5 | 7 |
| 1053.0 | 7 |
| 1053.5 | 7 |
| 1054.0 | 7 |
| 1054.5 | 7 |
| 1055.0 | 4.987 |
| 1055.5 | 5.372 |
| 1056.0 | 7 |
| 1056.5 | 7 |
| 1057.0 | 5.834 |
| 1057.5 | 5.189 |
| 1058.0 | 5.797 |
| 1058.5 | 5.072 |
| 1059.0 | 5.482 |
| 1059.5 | 5.297 |
| 1060.0 | 7 |
| 1060.5 | 7 |
| 1061.0 | 7 |
| 1061.5 | 7 |
| 1062.0 | 7 |
| 1062.5 | 7 |
| 1063.0 | 7 |
| 1063.5 | 7 |
| 1064.0 | 7 |
| 1064.5 | 7 |
| 1065.0 | 5.648 |
| 1065.5 | 5.423 |
| 1066.0 | 7 |
| 1066.5 | 5.792 |
| 1067.0 | 7 |
| 1067.5 | 5.356 |
| 1068.0 | 7 |
| 1068.5 | 5.231 |
| 1069.0 | 5.358 |
| 1069.5 | 7 |
| 1070.0 | 7 |
| 1070.5 | 7 |
| 1071.0 | 7 |
| 1071.5 | 7 |
| 1072.0 | 7 |
| 1072.5 | 7 |
| 1073.0 | 7 |
| 1073.5 | 7 |
| 1074.0 | 5.349 |
| 1074.5 | 7.021 |
| 1075.0 | 7 |
| 1075.5 | 7 |
| 1076.0 | 7 |
| 1076.5 | 7 |
| 1077.0 | 7 |
| 1077.5 | 5.505 |
| 1078.0 | 6.659 |
| 1078.5 | 7 |
| 1079.0 | 7 |
| 1079.5 | 7 |
| 1080.0 | 7 |
| 1080.5 | 7 |
| 1081.0 | 7 |
| 1081.5 | 7 |
| 1082.0 | 7 |
| 1082.5 | 6.217 |
| 1083.0 | 5.081 |
| 1083.5 | 5.591 |
| 1084.0 | 7 |
| 1084.5 | 7 |
| 1085.0 | 7 |
| 1085.5 | 7 |
| 1086.0 | 7 |
| 1086.5 | 7 |
| 1087.0 | 5.355 |
| 1087.5 | 5.188 |
| 1088.0 | 5.961 |
| 1088.5 | 7 |
| 1089.0 | 7 |
| 1089.5 | 5.043 |
| 1090.0 | 4.898 |
| 1090.5 | 4.98 |
| 1091.0 | 5.724 |
| 1091.5 | 7 |
| 1092.0 | 7 |
| 1092.5 | 4.993 |
| 1093.0 | 5.378 |
| 1093.5 | 7 |
| 1094.0 | 7 |
| 1094.5 | 6.452 |
| 1095.0 | 7 |
| 1095.5 | 5.59 |
| 1096.0 | 7 |
| 1096.5 | 6.543 |
| 1097.0 | 7 |
| 1097.5 | 7 |
| 1098.0 | 7 |
| 1098.5 | 7 |
| 1099.0 | 5.275 |
| 1099.5 | 5.451 |
| 1100.0 | 5.848 |
| 1100.5 | 7 |
| 1101.0 | 7 |
| 1101.5 | 7 |
| 1102.0 | 7 |
| 1102.5 | 5.582 |
| 1103.0 | 5.987 |
| 1103.5 | 6.213 |
| 1104.0 | 7 |
| 1104.5 | 7 |
| 1105.0 | 7 |
| 1105.5 | 7 |
| 1106.0 | 7 |
| 1106.5 | 7 |
| 1107.0 | 7 |
| 1107.5 | 5.158 |
| 1108.0 | 4.978 |
| 1108.5 | 6.146 |
| 1109.0 | 7 |
| 1109.5 | 7 |
| 1110.0 | 7 |
| 1110.5 | 7 |
| 1111.0 | 7 |
| 1111.5 | 7 |
| 1112.0 | 7 |
| 1112.5 | 7 |
| 1113.0 | 7 |
| 1113.5 | 7 |
| 1114.0 | 7 |
| 1114.5 | 7 |
| 1115.0 | 7 |
| 1115.5 | 7 |
| 1116.0 | 7 |
| 1116.5 | 7 |
| 1117.0 | 7 |
| 1117.5 | 7 |
| 1118.0 | 7 |
| 1118.5 | 7 |
| 1119.0 | 7 |
| 1119.5 | 7 |
| 1120.0 | 7 |
| 1120.5 | 7 |
| 1121.0 | 7 |
| 1121.5 | 7 |
| 1122.0 | 7 |
| 1122.5 | 7 |
| 1123.0 | 7 |
| 1123.5 | 7 |
| 1124.0 | 7 |
| 1124.5 | 5.675 |
| 1125.0 | 7 |
| 1125.5 | 7 |
| 1126.0 | 7 |
| 1126.5 | 5.375 |
| 1127.0 | 7 |
| 1127.5 | 7 |
| 1128.0 | 7 |
| 1128.5 | 7 |
| 1129.0 | 4.938 |
| 1129.5 | 4.963 |
| 1130.0 | 5.403 |
| 1130.5 | 7 |
| 1131.0 | 7 |
| 1131.5 | 7 |
| 1132.0 | 5.26 |
| 1132.5 | 7 |
| 1133.0 | 5.145 |
| 1133.5 | 7 |
| 1134.0 | 5.308 |
| 1134.5 | 7 |
| 1135.0 | 5.394 |
| 1135.5 | 5.741 |
| 1136.0 | 5.275 |
| 1136.5 | 7 |
| 1137.0 | 7 |
| 1137.5 | 7 |
| 1138.0 | 5.681 |
| 1138.5 | 7 |
| 1139.0 | 7 |
| 1139.5 | 7 |
| 1140.0 | 4.985 |
| 1140.5 | 4.97 |
| 1141.0 | 5.042 |
| 1141.5 | 7 |
| 1142.0 | 7 |
| 1142.5 | 7 |
| 1143.0 | 7 |
| 1143.5 | 7 |
| 1144.0 | 7 |
| 1144.5 | 7 |
| 1145.0 | 7 |
| 1145.5 | 7 |
| 1146.0 | 7 |
| 1146.5 | 7 |
| 1147.0 | 5.715 |
| 1147.5 | 5.853 |
| 1148.0 | 7 |
| 1148.5 | 7 |
| 1149.0 | 7 |
| 1149.5 | 5.108 |
| 1150.0 | 4.802 |
| 1150.5 | 4.619 |
| 1151.0 | 4.761 |
| 1151.5 | 4.626 |
| 1152.0 | 5.071 |
| 1152.5 | 5.14 |
| 1153.0 | 7 |
| 1153.5 | 5.974 |
| 1154.0 | 7 |
| 1154.5 | 7 |
| 1155.0 | 5.955 |
| 1155.5 | 5.099 |
| 1156.0 | 7 |
| 1156.5 | 7 |
| 1157.0 | 7 |
| 1157.5 | 7 |
| 1158.0 | 7 |
| 1158.5 | 7 |
| 1159.0 | 7 |
| 1159.5 | 7 |
| 1160.0 | 7 |
| 1160.5 | 5.941 |
| 1161.0 | 7 |
| 1161.5 | 7 |
| 1162.0 | 5.355 |
| 1162.5 | 6.605 |
| 1163.0 | 7 |
| 1163.5 | 7 |
| 1164.0 | 7 |
| 1164.5 | 5.873 |
| 1165.0 | 6.788 |
| 1165.5 | 7 |
| 1166.0 | 7 |
| 1166.5 | 7 |
| 1167.0 | 7 |
| 1167.5 | 4.732 |
| 1168.0 | 4.801 |
| 1168.5 | 5.036 |
| 1169.0 | 5.319 |
| 1169.5 | 4.844 |
| 1170.0 | 4.737 |
| 1170.5 | 4.808 |
| 1171.0 | 5.841 |
| 1171.5 | 7 |
| 1172.0 | 7 |
| 1172.5 | 7 |
| 1173.0 | 4.976 |
| 1173.5 | 4.744 |
| 1174.0 | 4.677 |
| 1174.5 | 5.063 |
| 1175.0 | 5.476 |
| 1175.5 | 5.083 |
| 1176.0 | 4.834 |
| 1176.5 | 4.985 |
| 1177.0 | 5.303 |
| 1177.5 | 5.106 |
| 1178.0 | 4.622 |
| 1178.5 | 4.686 |
| 1179.0 | 4.721 |
| 1179.5 | 4.748 |
| 1180.0 | 4.891 |
| 1180.5 | 4.693 |
| 1181.0 | 5.11 |
| 1181.5 | 4.683 |
| 1182.0 | 4.818 |
| 1182.5 | 4.753 |
| 1183.0 | 4.818 |
| 1183.5 | 4.856 |
| 1184.0 | 4.87 |
| 1184.5 | 4.868 |
| 1185.0 | 4.793 |
| 1185.5 | 4.902 |
| 1186.0 | 4.821 |
| 1186.5 | 5.727 |
| 1187.0 | 7 |
| 1187.5 | 6.797 |
| 1188.0 | 7 |
| 1188.5 | 5.08 |
| 1189.0 | 5.384 |
| 1189.5 | 5.052 |
| 1190.0 | 5.055 |
| 1190.5 | 5.044 |
| 1191.0 | 4.881 |
| 1191.5 | 4.882 |
| 1192.0 | 4.675 |
| 1192.5 | 4.501 |
| 1193.0 | 4.56 |
| 1193.5 | 4.547 |
| 1194.0 | 4.542 |
| 1194.5 | 4.46 |
| 1195.0 | 4.421 |
| 1195.5 | 4.348 |
| 1196.0 | 4.302 |
| 1196.5 | 4.268 |
| 1197.0 | 4.237 |
| 1197.5 | 4.186 |
| 1198.0 | 4.244 |
| 1198.5 | 4.285 |
| 1199.0 | 4.217 |
| 1199.5 | 4.225 |
| 1200.0 | 4.195 |
| 1200.5 | 4.23 |
| 1201.0 | 4.295 |
| 1201.5 | 4.285 |
| 1202.0 | 4.385 |
| 1202.5 | 4.227 |
| 1203.0 | 4.229 |
| 1203.5 | 4.165 |
| 1204.0 | 4.148 |
| 1204.5 | 4.175 |
| 1205.0 | 4.14 |
| 1205.5 | 4.171 |
| 1206.0 | 4.17 |
| 1206.5 | 4.225 |
| 1207.0 | 4.272 |
| 1207.5 | 4.33 |
| 1208.0 | 4.463 |
| 1208.5 | 4.443 |
| 1209.0 | 4.622 |
| 1209.5 | 4.735 |
| 1210.0 | 5.159 |
| 1210.5 | 4.842 |
| 1211.0 | 4.904 |
| 1211.5 | 5.329 |
| 1212.0 | 5.616 |
| 1212.5 | 5 |
| 1213.0 | 4.586 |
| 1213.5 | 4.625 |
| 1214.0 | 4.976 |
| 1214.5 | 7 |
| 1215.0 | 5.549 |
| 1215.5 | 5.384 |
| 1216.0 | 5.867 |
| 1216.5 | 7 |
| 1217.0 | 7 |
| 1217.5 | 5.339 |
| 1218.0 | 4.807 |
| 1218.5 | 4.723 |
| 1219.0 | 4.848 |
| 1219.5 | 4.567 |
| 1220.0 | 4.804 |
| 1220.5 | 4.614 |
| 1221.0 | 4.596 |
| 1221.5 | 4.454 |
| 1222.0 | 4.495 |
| 1222.5 | 4.598 |
| 1223.0 | 4.65 |
| 1223.5 | 4.683 |
| 1224.0 | 4.553 |
| 1224.5 | 4.479 |
| 1225.0 | 4.281 |
| 1225.5 | 4.166 |
| 1226.0 | 4.069 |
| 1226.5 | 4.056 |
| 1227.0 | 4.097 |
| 1227.5 | 4.167 |
| 1228.0 | 4.174 |
| 1228.5 | 4.132 |
| 1229.0 | 4.081 |
| 1229.5 | 4.12 |
| 1230.0 | 4.126 |
| 1230.5 | 4.15 |
| 1231.0 | 4.174 |
| 1231.5 | 4.217 |
| 1232.0 | 4.308 |
| 1232.5 | 4.366 |
| 1233.0 | 4.648 |
| 1233.5 | 4.964 |
| 1234.0 | 7 |
| 1234.5 | 7 |
| 1235.0 | 5.748 |
| 1235.5 | 4.881 |
| 1236.0 | 4.827 |
| 1236.5 | 4.987 |
| 1237.0 | 7 |
| 1237.5 | 7 |
| 1238.0 | 7 |
| 1238.5 | 7 |
| 1239.0 | 6.421 |
| 1239.5 | 7 |
| 1240.0 | 7 |
| 1240.5 | 7 |
| 1241.0 | 5.047 |
| 1241.5 | 5.646 |
| 1242.0 | 5.166 |
| 1242.5 | 7 |
| 1243.0 | 7 |
| 1243.5 | 7 |
| 1244.0 | 5.647 |
| 1244.5 | 7 |
| 1245.0 | 7 |
| 1245.5 | 7 |
| 1246.0 | 7 |
| 1246.5 | 7 |
| 1247.0 | 7 |
| 1247.5 | 7 |
| 1248.0 | 7 |
| 1248.5 | 6.149 |
| 1249.0 | 5.291 |
| 1249.5 | 7 |
| 1250.0 | 7 |
| 1250.5 | 6.168 |
| 1251.0 | 4.966 |
| 1251.5 | 4.695 |
| 1252.0 | 4.919 |
| 1252.5 | 4.978 |
| 1253.0 | 5.472 |
| 1253.5 | 5.349 |
| 1254.0 | 7 |
| 1254.5 | 5.979 |
| 1255.0 | 7 |
| 1255.5 | 7 |
| 1256.0 | 7 |
| 1256.5 | 5.12 |
| 1257.0 | 5.574 |
| 1257.5 | 4.98 |
| 1258.0 | 5.309 |
| 1258.5 | 5.189 |
| 1259.0 | 7 |
| 1259.5 | 7 |
| 1260.0 | 7 |
| 1260.5 | 7 |
| 1261.0 | 7 |
| 1261.5 | 5.158 |
| 1262.0 | 5.239 |
| 1262.5 | 4.781 |
| 1263.0 | 5.007 |
| 1263.5 | 4.74 |
| 1264.0 | 4.672 |
| 1264.5 | 4.437 |
| 1265.0 | 4.37 |
| 1265.5 | 4.315 |
| 1266.0 | 4.307 |
| 1266.5 | 4.141 |
| 1267.0 | 4.043 |
| 1267.5 | 4.017 |
| 1268.0 | 4.066 |
| 1268.5 | 4.136 |
| 1269.0 | 4.216 |
| 1269.5 | 4.301 |
| 1270.0 | 4.485 |
| 1270.5 | 4.703 |
| 1271.0 | 5.107 |
| 1271.5 | 7 |
| 1272.0 | 5.393 |
| 1272.5 | 5.026 |
| 1273.0 | 4.828 |
| 1273.5 | 4.872 |
| 1274.0 | 4.983 |
| 1274.5 | 4.864 |
| 1275.0 | 5.049 |
| 1275.5 | 5.654 |
| 1276.0 | 7 |
| 1276.5 | 7 |
| 1277.0 | 5.225 |
| 1277.5 | 4.658 |
| 1278.0 | 4.817 |
| 1278.5 | 5.059 |
| 1279.0 | 7 |
| 1279.5 | 4.696 |
| 1280.0 | 4.721 |
| 1280.5 | 4.538 |
| 1281.0 | 4.567 |
| 1281.5 | 4.468 |
| 1282.0 | 4.436 |
| 1282.5 | 4.535 |
| 1283.0 | 4.499 |
| 1283.5 | 4.507 |
| 1284.0 | 4.787 |
| 1284.5 | 6.064 |
| 1285.0 | 7 |
| 1285.5 | 7 |
| 1286.0 | 7 |
| 1286.5 | 7 |
| 1287.0 | 5.049 |
| 1287.5 | 4.89 |
| 1288.0 | 4.995 |
| 1288.5 | 7 |
| 1289.0 | 7 |
| 1289.5 | 7 |
| 1290.0 | 5.688 |
| 1290.5 | 5.858 |
| 1291.0 | 5.111 |
| 1291.5 | 6.017 |
| 1292.0 | 6.199 |
| 1292.5 | 7 |
| 1293.0 | 5.054 |
| 1293.5 | 4.751 |
| 1294.0 | 4.672 |
| 1294.5 | 5.064 |
| 1295.0 | 5.347 |
| 1295.5 | 7 |
| 1296.0 | 5.183 |
| 1296.5 | 4.851 |
| 1297.0 | 4.824 |
| 1297.5 | 4.678 |
| 1298.0 | 5.224 |
| 1298.5 | 5.267 |
| 1299.0 | 7 |
| 1299.5 | 7 |
| 1300.0 | 5.231 |
| 1300.5 | 5.455 |
| 1301.0 | 4.757 |
| 1301.5 | 4.841 |
| 1302.0 | 4.926 |
| 1302.5 | 5.606 |
| 1303.0 | 7 |
| 1303.5 | 7 |
| 1304.0 | 7 |
| 1304.5 | 7 |
| 1305.0 | 7 |
| 1305.5 | 7 |
| 1306.0 | 7 |
| 1306.5 | 7 |
| 1307.0 | 7 |
| 1307.5 | 7 |
| 1308.0 | 7 |
| 1308.5 | 6.19 |
| 1309.0 | 7 |
| 1309.5 | 7 |
| 1310.0 | 5.011 |
| 1310.5 | 4.952 |
| 1311.0 | 4.686 |
| 1311.5 | 4.729 |
| 1312.0 | 4.603 |
| 1312.5 | 4.601 |
| 1313.0 | 4.853 |
| 1313.5 | 5.485 |
| 1314.0 | 5.081 |
| 1314.5 | 5.013 |
| 1315.0 | 4.639 |
| 1315.5 | 4.946 |
| 1316.0 | 4.573 |
| 1316.5 | 4.95 |
| 1317.0 | 4.881 |
| 1317.5 | 7 |
| 1318.0 | 7 |
| 1318.5 | 5.408 |
| 1319.0 | 5.581 |
| 1319.5 | 7 |
| 1320.0 | 7 |
| 1320.5 | 7 |
| 1321.0 | 7 |
| 1321.5 | 5.234 |
| 1322.0 | 5.604 |
| 1322.5 | 5.235 |
| 1323.0 | 7 |
| 1323.5 | 7 |
| 1324.0 | 7 |
| 1324.5 | 4.998 |
| 1325.0 | 7 |
| 1325.5 | 5.15 |
| 1326.0 | 7 |
| 1326.5 | 5.948 |
| 1327.0 | 5.736 |
| 1327.5 | 7 |
| 1328.0 | 5.409 |
| 1328.5 | 7 |
| 1329.0 | 7 |
| 1329.5 | 7 |
| 1330.0 | 7 |
| 1330.5 | 7 |
| 1331.0 | 7 |
| 1331.5 | 5.249 |
| 1332.0 | 5.07 |
| 1332.5 | 7 |
| 1333.0 | 7 |
| 1333.5 | 5.519 |
| 1334.0 | 4.901 |
| 1334.5 | 5.389 |
| 1335.0 | 5.167 |
| 1335.5 | 7 |
| 1336.0 | 7 |
| 1336.5 | 7 |
| 1337.0 | 7 |
| 1337.5 | 7 |
| 1338.0 | 7 |
| 1338.5 | 7 |
| 1339.0 | 5.399 |
| 1339.5 | 5.38 |
| 1340.0 | 4.888 |
| 1340.5 | 5.01 |
| 1341.0 | 5.154 |
| 1341.5 | 7 |
| 1342.0 | 7 |
| 1342.5 | 7 |
| 1343.0 | 5.245 |
| 1343.5 | 5.374 |
| 1344.0 | 5.073 |
| 1344.5 | 7 |
| 1345.0 | 7 |
| 1345.5 | 7 |
| 1346.0 | 5.341 |
| 1346.5 | 5.087 |
| 1347.0 | 5.173 |
| 1347.5 | 5.816 |
| 1348.0 | 7 |
| 1348.5 | 7 |
| 1349.0 | 5.458 |
| 1349.5 | 5.129 |
| 1350.0 | 6.3 |
| 1350.5 | 5.7 |
| 1351.0 | 5.294 |
| 1351.5 | 4.751 |
| 1352.0 | 4.868 |
| 1352.5 | 4.752 |
| 1353.0 | 5.037 |
| 1353.5 | 5.132 |
| 1354.0 | 4.921 |
| 1354.5 | 4.645 |
| 1355.0 | 4.391 |
| 1355.5 | 4.447 |
| 1356.0 | 4.313 |
| 1356.5 | 4.353 |
| 1357.0 | 4.293 |
| 1357.5 | 4.332 |
| 1358.0 | 4.324 |
| 1358.5 | 4.34 |
| 1359.0 | 4.457 |
| 1359.5 | 4.651 |
| 1360.0 | 4.622 |
| 1360.5 | 4.686 |
| 1361.0 | 4.709 |
| 1361.5 | 5.014 |
| 1362.0 | 5.065 |
| 1362.5 | 4.865 |
| 1363.0 | 5.582 |
| 1363.5 | 5.323 |
| 1364.0 | 5.35 |
| 1364.5 | 4.641 |
| 1365.0 | 4.697 |
| 1365.5 | 4.616 |
| 1366.0 | 4.758 |
| 1366.5 | 4.635 |
| 1367.0 | 4.576 |
| 1367.5 | 4.432 |
| 1368.0 | 4.27 |
| 1368.5 | 4.167 |
| 1369.0 | 4.122 |
| 1369.5 | 4.106 |
| 1370.0 | 4.081 |
| 1370.5 | 4.012 |
| 1371.0 | 3.997 |
| 1371.5 | 3.99 |
| 1372.0 | 4.032 |
| 1372.5 | 4.072 |
| 1373.0 | 4.131 |
| 1373.5 | 4.117 |
| 1374.0 | 4.132 |
| 1374.5 | 4.173 |
| 1375.0 | 4.342 |
| 1375.5 | 4.412 |
| 1376.0 | 4.502 |
| 1376.5 | 4.587 |
| 1377.0 | 4.579 |
| 1377.5 | 4.8 |
| 1378.0 | 4.963 |
| 1378.5 | 5.038 |
| 1379.0 | 4.608 |
| 1379.5 | 4.358 |
| 1380.0 | 4.437 |
| 1380.5 | 4.585 |
| 1381.0 | 4.754 |
| 1381.5 | 4.481 |
| 1382.0 | 4.299 |
| 1382.5 | 4.272 |
| 1383.0 | 4.398 |
| 1383.5 | 4.418 |
| 1384.0 | 4.416 |
| 1384.5 | 4.334 |
| 1385.0 | 4.359 |
| 1385.5 | 4.334 |
| 1386.0 | 4.308 |
| 1386.5 | 4.32 |
| 1387.0 | 4.393 |
| 1387.5 | 4.455 |
| 1388.0 | 4.402 |
| 1388.5 | 4.438 |
| 1389.0 | 4.539 |
| 1389.5 | 4.933 |
| 1390.0 | 4.877 |
| 1390.5 | 5.256 |
| 1391.0 | 4.832 |
| 1391.5 | 5.314 |
| 1392.0 | 4.865 |
| 1392.5 | 4.827 |
| 1393.0 | 4.573 |
| 1393.5 | 4.589 |
| 1394.0 | 4.998 |
| 1394.5 | 5.475 |
| 1395.0 | 5.312 |
| 1395.5 | 5.06 |
| 1396.0 | 5.486 |
| 1396.5 | 7 |
| 1397.0 | 7 |
| 1397.5 | 7 |
| 1398.0 | 7 |
| 1398.5 | 7 |
| 1399.0 | 7 |
| 1399.5 | 6.072 |
| 1400.0 | 7 |
| 1400.5 | 5.301 |
| 1401.0 | 6.269 |
| 1401.5 | 7 |
| 1402.0 | 7 |
| 1402.5 | 7 |
| 1403.0 | 7 |
| 1403.5 | 7 |
| 1404.0 | 5.392 |
| 1404.5 | 4.797 |
| 1405.0 | 5.12 |
| 1405.5 | 7 |
| 1406.0 | 7 |
| 1406.5 | 5.809 |
| 1407.0 | 4.741 |
| 1407.5 | 4.747 |
| 1408.0 | 4.573 |
| 1408.5 | 5.062 |
| 1409.0 | 5.091 |
| 1409.5 | 6.129 |
| 1410.0 | 4.906 |
| 1410.5 | 5.355 |
| 1411.0 | 5.228 |
| 1411.5 | 5.419 |
| 1412.0 | 4.823 |
| 1412.5 | 4.954 |
| 1413.0 | 4.966 |
| 1413.5 | 5.034 |
| 1414.0 | 4.834 |
| 1414.5 | 4.852 |
| 1415.0 | 4.937 |